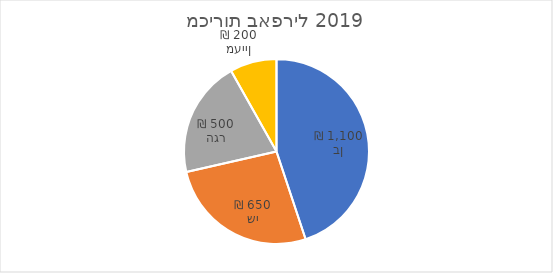
| Category | מכירות באפריל 2019 |
|---|---|
| בן | 1100 |
| שי | 650 |
| הגר | 500 |
| מעיין | 200 |